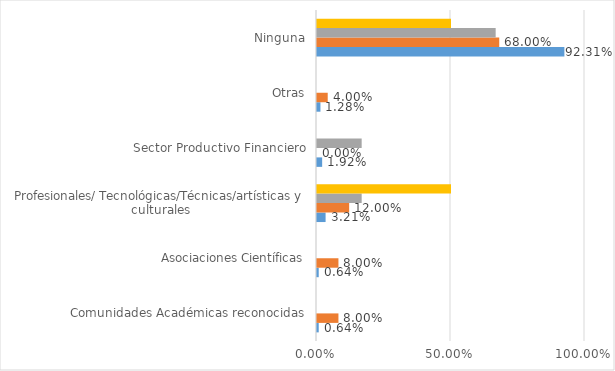
| Category | Series 0 | Series 1 | Series 2 | Series 3 |
|---|---|---|---|---|
| Comunidades Académicas reconocidas | 0.006 | 0.08 | 0 | 0 |
| Asociaciones Científicas | 0.006 | 0.08 | 0 | 0 |
| Profesionales/ Tecnológicas/Técnicas/artísticas y culturales | 0.032 | 0.12 | 0.167 | 0.5 |
| Sector Productivo Financiero | 0.019 | 0 | 0.167 | 0 |
| Otras | 0.013 | 0.04 | 0 | 0 |
| Ninguna | 0.923 | 0.68 | 0.667 | 0.5 |